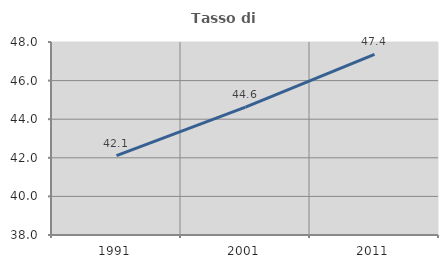
| Category | Tasso di occupazione   |
|---|---|
| 1991.0 | 42.113 |
| 2001.0 | 44.627 |
| 2011.0 | 47.36 |